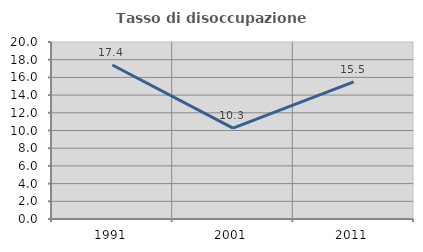
| Category | Tasso di disoccupazione giovanile  |
|---|---|
| 1991.0 | 17.406 |
| 2001.0 | 10.274 |
| 2011.0 | 15.484 |